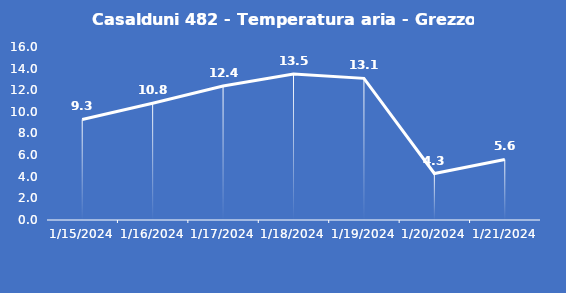
| Category | Casalduni 482 - Temperatura aria - Grezzo (°C) |
|---|---|
| 1/15/24 | 9.3 |
| 1/16/24 | 10.8 |
| 1/17/24 | 12.4 |
| 1/18/24 | 13.5 |
| 1/19/24 | 13.1 |
| 1/20/24 | 4.3 |
| 1/21/24 | 5.6 |